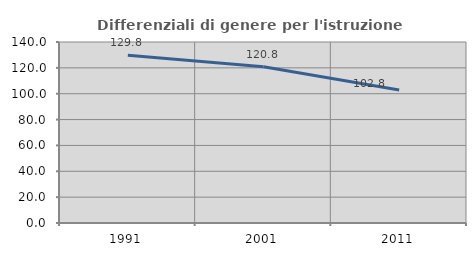
| Category | Differenziali di genere per l'istruzione superiore |
|---|---|
| 1991.0 | 129.781 |
| 2001.0 | 120.796 |
| 2011.0 | 102.827 |